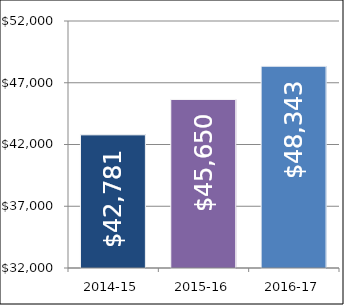
| Category | Series 0 |
|---|---|
| 2014-15 | 42781 |
| 2015-16 | 45650 |
| 2016-17 | 48343 |